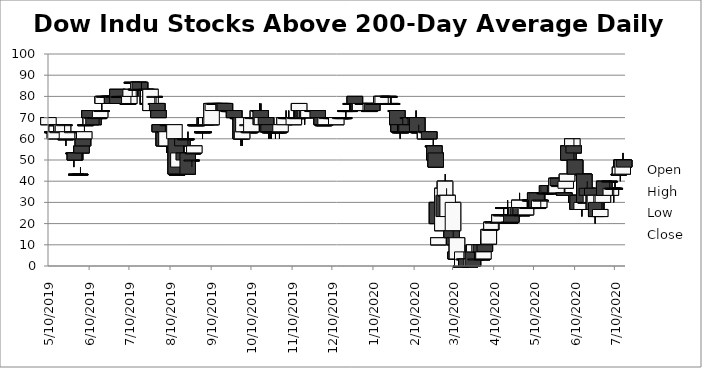
| Category | Open | High | Low | Close |
|---|---|---|---|---|
| 5/10/19 | 66.66 | 70 | 63.33 | 70 |
| 5/13/19 | 63.33 | 63.33 | 60 | 63.33 |
| 5/14/19 | 63.33 | 63.33 | 63.33 | 63.33 |
| 5/15/19 | 60 | 63.33 | 60 | 63.33 |
| 5/16/19 | 66.66 | 66.66 | 66.66 | 66.66 |
| 5/17/19 | 63.33 | 66.66 | 63.33 | 63.33 |
| 5/20/19 | 63.33 | 66.66 | 63.33 | 66.66 |
| 5/21/19 | 63.33 | 66.66 | 63.33 | 66.66 |
| 5/22/19 | 66.66 | 66.66 | 63.33 | 66.66 |
| 5/23/19 | 60 | 60 | 56.66 | 60 |
| 5/24/19 | 60 | 63.33 | 60 | 63.33 |
| 5/28/19 | 63.33 | 63.33 | 63.33 | 63.33 |
| 5/29/19 | 53.33 | 53.33 | 46.66 | 53.33 |
| 5/30/19 | 53.33 | 53.33 | 50 | 50 |
| 5/31/19 | 43.33 | 43.33 | 43.33 | 43.33 |
| 6/3/19 | 43.33 | 46.66 | 43.33 | 43.33 |
| 6/4/19 | 56.66 | 56.66 | 50 | 53.33 |
| 6/5/19 | 60 | 60 | 56.66 | 56.66 |
| 6/6/19 | 60 | 66.66 | 60 | 63.33 |
| 6/7/19 | 66.66 | 73.33 | 66.66 | 66.66 |
| 6/10/19 | 73.33 | 73.33 | 70 | 70 |
| 6/11/19 | 66.66 | 70 | 66.66 | 70 |
| 6/12/19 | 70 | 70 | 70 | 70 |
| 6/13/19 | 70 | 70 | 66.66 | 66.66 |
| 6/14/19 | 70 | 70 | 70 | 70 |
| 6/17/19 | 70 | 70 | 66.66 | 70 |
| 6/18/19 | 70 | 73.33 | 70 | 73.33 |
| 6/19/19 | 73.33 | 76.66 | 73.33 | 73.33 |
| 6/20/19 | 76.66 | 80 | 76.66 | 80 |
| 6/21/19 | 80 | 80 | 76.66 | 80 |
| 6/24/19 | 80 | 80 | 80 | 80 |
| 6/25/19 | 80 | 80 | 76.66 | 80 |
| 6/26/19 | 80 | 80 | 80 | 80 |
| 6/27/19 | 80 | 80 | 76.66 | 76.66 |
| 6/28/19 | 80 | 83.33 | 80 | 80 |
| 7/1/19 | 83.33 | 83.33 | 76.66 | 76.66 |
| 7/2/19 | 80 | 80 | 80 | 80 |
| 7/3/19 | 80 | 80 | 80 | 80 |
| 7/5/19 | 80 | 80 | 80 | 80 |
| 7/8/19 | 80 | 80 | 80 | 80 |
| 7/9/19 | 76.66 | 80 | 76.66 | 76.66 |
| 7/10/19 | 76.66 | 80 | 76.66 | 80 |
| 7/11/19 | 80 | 83.33 | 76.66 | 83.33 |
| 7/12/19 | 86.66 | 86.66 | 80 | 86.66 |
| 7/15/19 | 83.33 | 83.33 | 80 | 83.33 |
| 7/16/19 | 83.33 | 86.66 | 80 | 83.33 |
| 7/17/19 | 83.33 | 86.66 | 83.33 | 86.66 |
| 7/18/19 | 86.66 | 86.66 | 76.66 | 83.33 |
| 7/19/19 | 83.33 | 86.66 | 83.33 | 83.33 |
| 7/22/19 | 83.33 | 83.33 | 80 | 83.33 |
| 7/23/19 | 83.33 | 83.33 | 80 | 83.33 |
| 7/24/19 | 76.66 | 80 | 73.33 | 76.66 |
| 7/25/19 | 76.66 | 76.66 | 73.33 | 76.66 |
| 7/26/19 | 73.33 | 83.33 | 73.33 | 83.33 |
| 7/29/19 | 80 | 80 | 76.66 | 80 |
| 7/30/19 | 76.66 | 80 | 76.66 | 76.66 |
| 7/31/19 | 76.66 | 76.66 | 73.33 | 73.33 |
| 8/1/19 | 73.33 | 73.33 | 70 | 70 |
| 8/2/19 | 66.66 | 66.66 | 63.33 | 63.33 |
| 8/5/19 | 63.33 | 63.33 | 56.66 | 56.66 |
| 8/6/19 | 63.33 | 66.66 | 56.66 | 63.33 |
| 8/7/19 | 56.66 | 63.33 | 53.33 | 63.33 |
| 8/8/19 | 66.66 | 66.66 | 66.66 | 66.66 |
| 8/9/19 | 66.66 | 66.66 | 66.66 | 66.66 |
| 8/12/19 | 66.66 | 66.66 | 63.33 | 66.66 |
| 8/13/19 | 60 | 66.66 | 60 | 66.66 |
| 8/14/19 | 60 | 60 | 43.33 | 43.33 |
| 8/15/19 | 43.33 | 43.33 | 43.33 | 43.33 |
| 8/16/19 | 46.66 | 53.33 | 46.66 | 53.33 |
| 8/19/19 | 60 | 60 | 56.66 | 56.66 |
| 8/20/19 | 53.33 | 56.66 | 50 | 50 |
| 8/21/19 | 60 | 60 | 60 | 60 |
| 8/22/19 | 60 | 60 | 60 | 60 |
| 8/23/19 | 53.33 | 63.33 | 43.33 | 43.33 |
| 8/26/19 | 50 | 50 | 46.66 | 50 |
| 8/27/19 | 53.33 | 53.33 | 53.33 | 53.33 |
| 8/28/19 | 53.33 | 56.66 | 53.33 | 56.66 |
| 8/29/19 | 66.66 | 66.66 | 66.66 | 66.66 |
| 8/30/19 | 66.66 | 66.66 | 66.66 | 66.66 |
| 9/3/19 | 63.33 | 63.33 | 60 | 63.33 |
| 9/4/19 | 63.33 | 63.33 | 63.33 | 63.33 |
| 9/5/19 | 70 | 70 | 66.66 | 66.66 |
| 9/6/19 | 66.66 | 70 | 66.66 | 70 |
| 9/9/19 | 66.66 | 70 | 66.66 | 70 |
| 9/10/19 | 66.66 | 76.66 | 66.66 | 76.66 |
| 9/11/19 | 73.33 | 76.66 | 73.33 | 76.66 |
| 9/12/19 | 76.66 | 76.66 | 76.66 | 76.66 |
| 9/13/19 | 76.66 | 76.66 | 76.66 | 76.66 |
| 9/16/19 | 76.66 | 76.66 | 76.66 | 76.66 |
| 9/17/19 | 76.66 | 76.66 | 76.66 | 76.66 |
| 9/18/19 | 76.66 | 76.66 | 73.33 | 76.66 |
| 9/19/19 | 76.66 | 76.66 | 73.33 | 73.33 |
| 9/20/19 | 76.66 | 76.66 | 73.33 | 73.33 |
| 9/23/19 | 73.33 | 73.33 | 73.33 | 73.33 |
| 9/24/19 | 73.33 | 73.33 | 73.33 | 73.33 |
| 9/25/19 | 73.33 | 73.33 | 73.33 | 73.33 |
| 9/26/19 | 73.33 | 73.33 | 73.33 | 73.33 |
| 9/27/19 | 73.33 | 73.33 | 70 | 70 |
| 9/30/19 | 70 | 70 | 70 | 70 |
| 10/1/19 | 70 | 70 | 70 | 70 |
| 10/2/19 | 70 | 70 | 56.66 | 60 |
| 10/3/19 | 60 | 63.33 | 56.66 | 63.33 |
| 10/4/19 | 63.33 | 70 | 63.33 | 70 |
| 10/7/19 | 66.66 | 70 | 66.66 | 66.66 |
| 10/8/19 | 63.33 | 63.33 | 63.33 | 63.33 |
| 10/9/19 | 63.33 | 63.33 | 63.33 | 63.33 |
| 10/10/19 | 63.33 | 70 | 63.33 | 70 |
| 10/11/19 | 70 | 70 | 70 | 70 |
| 10/14/19 | 70 | 70 | 70 | 70 |
| 10/15/19 | 70 | 73.33 | 66.66 | 73.33 |
| 10/16/19 | 73.33 | 76.66 | 73.33 | 73.33 |
| 10/17/19 | 73.33 | 76.66 | 66.66 | 66.66 |
| 10/18/19 | 66.66 | 70 | 63.33 | 70 |
| 10/21/19 | 70 | 70 | 66.66 | 66.66 |
| 10/22/19 | 66.66 | 66.66 | 63.33 | 63.33 |
| 10/23/19 | 66.66 | 66.66 | 60 | 63.33 |
| 10/24/19 | 63.33 | 63.33 | 60 | 63.33 |
| 10/25/19 | 63.33 | 63.33 | 60 | 63.33 |
| 10/28/19 | 63.33 | 63.33 | 60 | 63.33 |
| 10/29/19 | 63.33 | 63.33 | 63.33 | 63.33 |
| 10/30/19 | 63.33 | 63.33 | 63.33 | 63.33 |
| 10/31/19 | 63.33 | 63.33 | 60 | 63.33 |
| 11/1/19 | 63.33 | 66.66 | 63.33 | 66.66 |
| 11/4/19 | 66.66 | 70 | 66.66 | 70 |
| 11/5/19 | 70 | 73.33 | 70 | 70 |
| 11/6/19 | 70 | 70 | 66.66 | 70 |
| 11/7/19 | 70 | 73.33 | 66.66 | 70 |
| 11/8/19 | 70 | 70 | 66.66 | 70 |
| 11/11/19 | 66.66 | 73.33 | 66.66 | 70 |
| 11/12/19 | 70 | 70 | 70 | 70 |
| 11/13/19 | 70 | 70 | 70 | 70 |
| 11/14/19 | 70 | 70 | 70 | 70 |
| 11/15/19 | 73.33 | 76.66 | 70 | 76.66 |
| 11/18/19 | 70 | 73.33 | 70 | 73.33 |
| 11/19/19 | 73.33 | 73.33 | 66.66 | 70 |
| 11/20/19 | 70 | 73.33 | 70 | 73.33 |
| 11/21/19 | 73.33 | 73.33 | 70 | 70 |
| 11/22/19 | 70 | 73.33 | 70 | 73.33 |
| 11/25/19 | 73.33 | 73.33 | 73.33 | 73.33 |
| 11/26/19 | 73.33 | 73.33 | 73.33 | 73.33 |
| 11/27/19 | 73.33 | 73.33 | 73.33 | 73.33 |
| 11/29/19 | 73.33 | 73.33 | 70 | 70 |
| 12/2/19 | 70 | 70 | 66.66 | 66.66 |
| 12/3/19 | 66.66 | 66.66 | 66.66 | 66.66 |
| 12/4/19 | 66.66 | 70 | 66.66 | 66.66 |
| 12/5/19 | 66.66 | 70 | 66.66 | 70 |
| 12/6/19 | 70 | 70 | 70 | 70 |
| 12/9/19 | 70 | 70 | 70 | 70 |
| 12/10/19 | 70 | 70 | 70 | 70 |
| 12/11/19 | 70 | 70 | 66.66 | 70 |
| 12/12/19 | 70 | 70 | 66.66 | 70 |
| 12/13/19 | 66.66 | 70 | 66.66 | 70 |
| 12/16/19 | 70 | 70 | 70 | 70 |
| 12/17/19 | 70 | 70 | 70 | 70 |
| 12/18/19 | 70 | 70 | 70 | 70 |
| 12/19/19 | 70 | 70 | 70 | 70 |
| 12/20/19 | 73.33 | 73.33 | 70 | 73.33 |
| 12/23/19 | 73.33 | 76.66 | 73.33 | 73.33 |
| 12/24/19 | 76.66 | 76.66 | 73.33 | 76.66 |
| 12/26/19 | 76.66 | 80 | 76.66 | 76.66 |
| 12/27/19 | 80 | 80 | 73.33 | 76.66 |
| 12/30/19 | 76.66 | 76.66 | 73.33 | 73.33 |
| 12/31/19 | 73.33 | 76.66 | 73.33 | 76.66 |
| 1/2/20 | 76.66 | 76.66 | 76.66 | 76.66 |
| 1/3/20 | 76.66 | 76.66 | 76.66 | 76.66 |
| 1/6/20 | 76.66 | 76.66 | 76.66 | 76.66 |
| 1/7/20 | 73.33 | 73.33 | 73.33 | 73.33 |
| 1/8/20 | 73.33 | 76.66 | 73.33 | 76.66 |
| 1/9/20 | 76.66 | 76.66 | 73.33 | 73.33 |
| 1/10/20 | 76.66 | 76.66 | 76.66 | 76.66 |
| 1/13/20 | 76.66 | 76.66 | 76.66 | 76.66 |
| 1/14/20 | 76.66 | 76.66 | 76.66 | 76.66 |
| 1/15/20 | 76.66 | 76.66 | 76.66 | 76.66 |
| 1/16/20 | 76.66 | 80 | 76.66 | 80 |
| 1/17/20 | 76.66 | 80 | 76.66 | 80 |
| 1/21/20 | 80 | 80 | 76.66 | 80 |
| 1/22/20 | 80 | 80 | 80 | 80 |
| 1/23/20 | 76.66 | 80 | 76.66 | 76.66 |
| 1/24/20 | 76.66 | 76.66 | 76.66 | 76.66 |
| 1/27/20 | 73.33 | 73.33 | 73.33 | 73.33 |
| 1/28/20 | 73.33 | 73.33 | 66.66 | 66.66 |
| 1/29/20 | 66.66 | 66.66 | 63.33 | 63.33 |
| 1/30/20 | 63.33 | 63.33 | 60 | 63.33 |
| 1/31/20 | 63.33 | 66.66 | 63.33 | 63.33 |
| 2/3/20 | 66.66 | 66.66 | 63.33 | 63.33 |
| 2/4/20 | 66.66 | 66.66 | 63.33 | 63.33 |
| 2/5/20 | 70 | 70 | 70 | 70 |
| 2/6/20 | 70 | 70 | 70 | 70 |
| 2/7/20 | 70 | 70 | 66.66 | 66.66 |
| 2/10/20 | 70 | 70 | 66.66 | 70 |
| 2/11/20 | 70 | 73.33 | 66.66 | 66.66 |
| 2/12/20 | 70 | 70 | 63.33 | 63.33 |
| 2/13/20 | 63.33 | 66.66 | 63.33 | 63.33 |
| 2/14/20 | 63.33 | 63.33 | 63.33 | 63.33 |
| 2/18/20 | 60 | 63.33 | 60 | 63.33 |
| 2/19/20 | 63.33 | 63.33 | 63.33 | 63.33 |
| 2/20/20 | 63.33 | 63.33 | 63.33 | 63.33 |
| 2/21/20 | 63.33 | 63.33 | 60 | 60 |
| 2/24/20 | 56.66 | 60 | 56.66 | 56.66 |
| 2/25/20 | 56.66 | 56.66 | 46.66 | 50 |
| 2/26/20 | 53.33 | 53.33 | 46.66 | 46.66 |
| 2/27/20 | 30 | 36.66 | 20 | 20 |
| 2/28/20 | 10 | 13.33 | 10 | 13.33 |
| 3/2/20 | 16.66 | 36.66 | 16.66 | 36.66 |
| 3/3/20 | 33.33 | 36.66 | 23.33 | 23.33 |
| 3/4/20 | 33.33 | 43.33 | 33.33 | 40 |
| 3/5/20 | 33.33 | 36.66 | 33.33 | 33.33 |
| 3/6/20 | 23.33 | 33.33 | 23.33 | 33.33 |
| 3/9/20 | 16.66 | 16.66 | 13.33 | 13.33 |
| 3/10/20 | 16.66 | 30 | 13.33 | 30 |
| 3/11/20 | 13.33 | 13.33 | 10 | 10 |
| 3/12/20 | 6.66 | 10 | 3.33 | 3.33 |
| 3/13/20 | 3.33 | 13.33 | 3.33 | 13.33 |
| 3/16/20 | 0.01 | 6.66 | 0.01 | 0.01 |
| 3/17/20 | 0.01 | 6.66 | 0.01 | 6.66 |
| 3/18/20 | 3.33 | 6.66 | 3.33 | 3.33 |
| 3/19/20 | 3.33 | 10 | 3.33 | 3.33 |
| 3/20/20 | 3.33 | 6.66 | 0.01 | 0.01 |
| 3/23/20 | 0.01 | 3.33 | 0.01 | 0.01 |
| 3/24/20 | 0.01 | 3.33 | 0.01 | 3.33 |
| 3/25/20 | 6.66 | 6.66 | 0.01 | 0.01 |
| 3/26/20 | 6.66 | 10 | 3.33 | 10 |
| 3/27/20 | 3.33 | 6.66 | 3.33 | 3.33 |
| 3/30/20 | 6.66 | 10 | 3.33 | 10 |
| 3/31/20 | 10 | 13.33 | 6.66 | 6.66 |
| 4/1/20 | 3.33 | 6.66 | 3.33 | 3.33 |
| 4/2/20 | 3.33 | 6.66 | 3.33 | 6.66 |
| 4/3/20 | 10 | 10 | 6.66 | 6.89 |
| 4/6/20 | 10.34 | 17.24 | 10.34 | 17.24 |
| 4/7/20 | 17.24 | 20.68 | 17.24 | 17.24 |
| 4/8/20 | 17.24 | 20.68 | 17.24 | 20.68 |
| 4/9/20 | 20.68 | 20.68 | 20.68 | 20.68 |
| 4/13/20 | 20.68 | 20.68 | 17.24 | 20.68 |
| 4/14/20 | 20.68 | 24.13 | 20.68 | 24.13 |
| 4/15/20 | 24.13 | 24.13 | 24.13 | 24.13 |
| 4/16/20 | 24.13 | 24.13 | 24.13 | 24.13 |
| 4/17/20 | 27.58 | 27.58 | 24.13 | 27.58 |
| 4/20/20 | 24.13 | 31.03 | 24.13 | 24.13 |
| 4/21/20 | 20.68 | 20.68 | 20.68 | 20.68 |
| 4/22/20 | 20.68 | 20.68 | 20.68 | 20.68 |
| 4/23/20 | 24.13 | 27.58 | 20.68 | 20.68 |
| 4/24/20 | 24.13 | 24.13 | 24.13 | 24.13 |
| 4/27/20 | 24.13 | 27.58 | 24.13 | 27.58 |
| 4/28/20 | 27.58 | 27.58 | 24.13 | 24.13 |
| 4/29/20 | 27.58 | 34.48 | 27.58 | 31.03 |
| 4/30/20 | 27.58 | 27.58 | 24.13 | 24.13 |
| 5/1/20 | 24.13 | 24.13 | 24.13 | 24.13 |
| 5/4/20 | 24.13 | 27.58 | 24.13 | 27.58 |
| 5/5/20 | 27.58 | 31.03 | 27.58 | 27.58 |
| 5/6/20 | 27.58 | 27.58 | 27.58 | 27.58 |
| 5/7/20 | 31.03 | 31.03 | 31.03 | 31.03 |
| 5/8/20 | 31.03 | 31.03 | 31.03 | 31.03 |
| 5/11/20 | 31.03 | 34.48 | 31.03 | 34.48 |
| 5/12/20 | 34.48 | 34.48 | 27.58 | 27.58 |
| 5/13/20 | 27.58 | 31.03 | 27.58 | 27.58 |
| 5/14/20 | 27.58 | 31.03 | 27.58 | 31.03 |
| 5/15/20 | 31.03 | 31.03 | 27.58 | 31.03 |
| 5/18/20 | 34.48 | 34.48 | 31.03 | 34.48 |
| 5/19/20 | 34.48 | 34.48 | 34.48 | 34.48 |
| 5/20/20 | 34.48 | 37.93 | 34.48 | 37.93 |
| 5/21/20 | 37.93 | 37.93 | 34.48 | 34.48 |
| 5/22/20 | 34.48 | 34.48 | 34.48 | 34.48 |
| 5/26/20 | 37.93 | 37.93 | 34.48 | 34.48 |
| 5/27/20 | 34.48 | 41.37 | 34.48 | 41.37 |
| 5/28/20 | 41.37 | 41.37 | 37.93 | 37.93 |
| 5/29/20 | 37.93 | 37.93 | 37.93 | 37.93 |
| 6/1/20 | 34.48 | 34.48 | 34.48 | 34.48 |
| 6/2/20 | 34.48 | 37.93 | 33.33 | 33.33 |
| 6/3/20 | 36.66 | 40 | 36.66 | 40 |
| 6/4/20 | 40 | 43.33 | 40 | 43.33 |
| 6/5/20 | 56.66 | 56.66 | 50 | 50 |
| 6/8/20 | 56.66 | 60 | 56.66 | 60 |
| 6/9/20 | 56.66 | 60 | 50 | 53.33 |
| 6/10/20 | 50 | 50 | 43.33 | 43.33 |
| 6/11/20 | 33.33 | 33.33 | 30 | 30 |
| 6/12/20 | 33.33 | 33.33 | 26.66 | 26.66 |
| 6/15/20 | 26.66 | 33.33 | 23.33 | 30 |
| 6/16/20 | 43.33 | 43.33 | 30 | 43.33 |
| 6/17/20 | 43.33 | 43.33 | 30 | 30 |
| 6/18/20 | 30 | 33.33 | 30 | 30 |
| 6/19/20 | 36.66 | 40 | 26.66 | 33.33 |
| 6/22/20 | 30 | 33.33 | 30 | 33.33 |
| 6/23/20 | 36.66 | 36.66 | 33.33 | 33.33 |
| 6/24/20 | 33.33 | 33.33 | 26.66 | 26.66 |
| 6/25/20 | 26.66 | 33.33 | 20 | 33.33 |
| 6/26/20 | 30 | 30 | 23.33 | 23.33 |
| 6/29/20 | 23.33 | 26.66 | 23.33 | 26.66 |
| 6/30/20 | 30 | 36.66 | 26.66 | 33.33 |
| 7/1/20 | 30 | 36.66 | 26.66 | 33.33 |
| 7/2/20 | 40 | 40 | 33.33 | 33.33 |
| 7/6/20 | 40 | 40 | 33.33 | 40 |
| 7/7/20 | 33.33 | 36.66 | 33.33 | 36.66 |
| 7/8/20 | 36.66 | 36.66 | 33.33 | 36.66 |
| 7/9/20 | 36.66 | 36.66 | 30 | 36.66 |
| 7/10/20 | 36.66 | 40 | 36.66 | 36.66 |
| 7/13/20 | 43.33 | 43.33 | 43.33 | 43.33 |
| 7/14/20 | 43.33 | 46.66 | 40 | 46.66 |
| 7/15/20 | 50 | 50 | 46.66 | 46.66 |
| 7/16/20 | 43.33 | 53.33 | 43.33 | 50 |
| 7/17/20 | 50 | 50 | 46.66 | 46.66 |